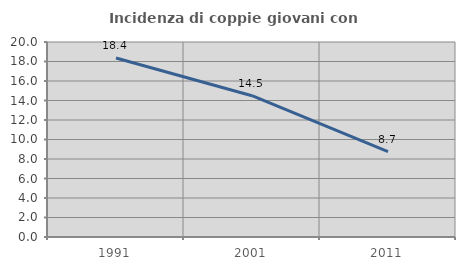
| Category | Incidenza di coppie giovani con figli |
|---|---|
| 1991.0 | 18.362 |
| 2001.0 | 14.493 |
| 2011.0 | 8.749 |